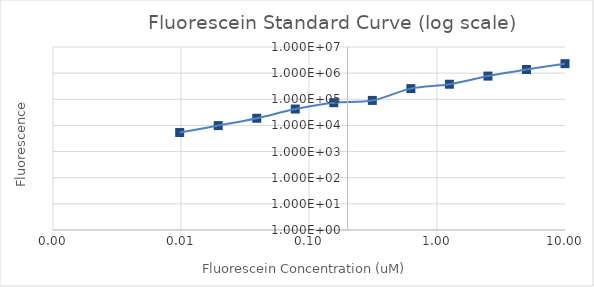
| Category | Series 1 |
|---|---|
| 10.0 | 2308172.75 |
| 5.0 | 1377927.25 |
| 2.5 | 771455 |
| 1.25 | 376569.5 |
| 0.625 | 255756.5 |
| 0.3125 | 90486.5 |
| 0.15625 | 74180.25 |
| 0.078125 | 42378 |
| 0.0390625 | 18808.25 |
| 0.01953125 | 9865.75 |
| 0.009765625 | 5350.75 |